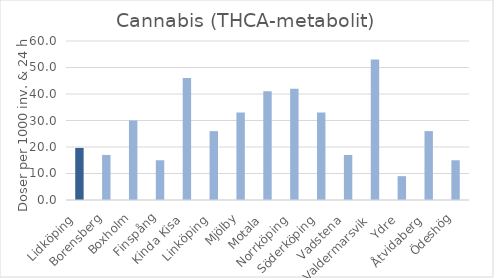
| Category | Cannabis (THCA-metabolit) |
|---|---|
| Lidköping  | 19.65 |
| Borensberg | 17 |
| Boxholm | 30 |
| Finspång | 15 |
| Kinda Kisa  | 46 |
| Linköping  | 26 |
| Mjölby | 33 |
| Motala  | 41 |
| Norrköping  | 42 |
| Söderköping  | 33 |
| Vadstena  | 17 |
| Valdermarsvik  | 53 |
| Ydre  | 9 |
| Åtvidaberg  | 26 |
| Ödeshög | 15 |